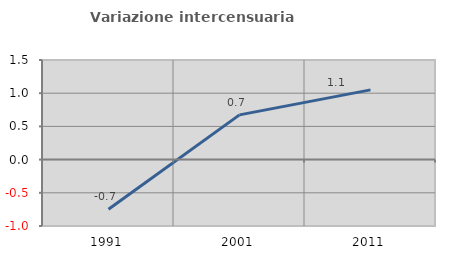
| Category | Variazione intercensuaria annua |
|---|---|
| 1991.0 | -0.748 |
| 2001.0 | 0.674 |
| 2011.0 | 1.05 |